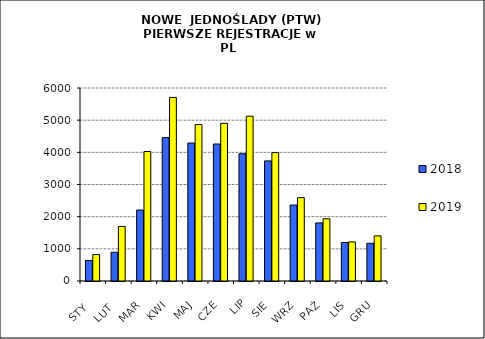
| Category | 2018 | 2019 |
|---|---|---|
|  STY  | 639 | 822 |
|  LUT  | 893 | 1696 |
| MAR | 2207 | 4025 |
| KWI | 4457 | 5707 |
| MAJ | 4289 | 4864 |
| CZE | 4259 | 4902 |
| LIP | 3956 | 5123 |
| SIE | 3733 | 3991 |
| WRZ | 2361 | 2591 |
| PAŹ | 1806 | 1935 |
| LIS | 1198 | 1215 |
| GRU | 1173 | 1403 |